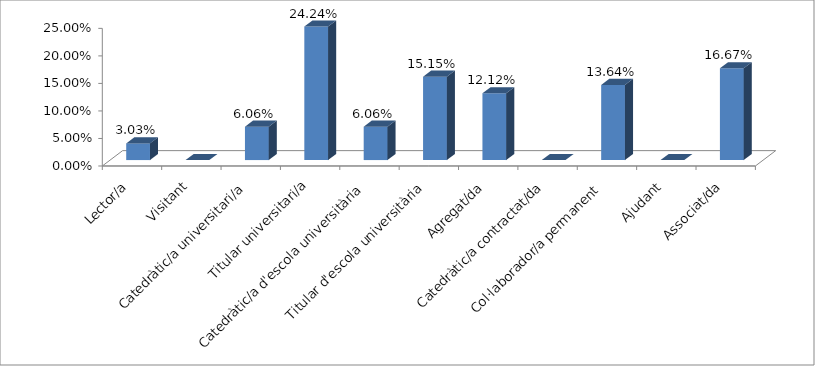
| Category | Series 0 |
|---|---|
| Lector/a | 0.03 |
| Visitant | 0 |
| Catedràtic/a universitari/a | 0.061 |
| Titular universitari/a | 0.242 |
| Catedràtic/a d'escola universitària | 0.061 |
| Titular d'escola universitària | 0.152 |
| Agregat/da | 0.121 |
| Catedràtic/a contractat/da | 0 |
| Col·laborador/a permanent | 0.136 |
| Ajudant | 0 |
| Associat/da | 0.167 |